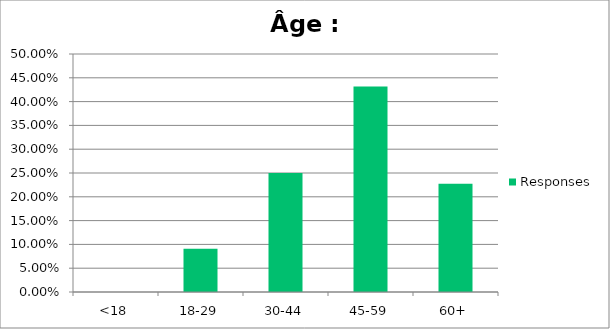
| Category | Responses |
|---|---|
| <18 | 0 |
| 18-29 | 0.091 |
| 30-44 | 0.25 |
| 45-59 | 0.432 |
| 60+ | 0.227 |